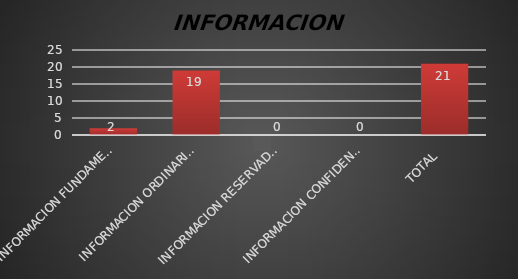
| Category | Series 1 |
|---|---|
| INFORMACION FUNDAMENTAL  | 2 |
| INFORMACION ORDINARIA  | 19 |
| INFORMACION RESERVADA  | 0 |
| INFORMACION CONFIDENCIAL  | 0 |
| TOTAL  | 21 |